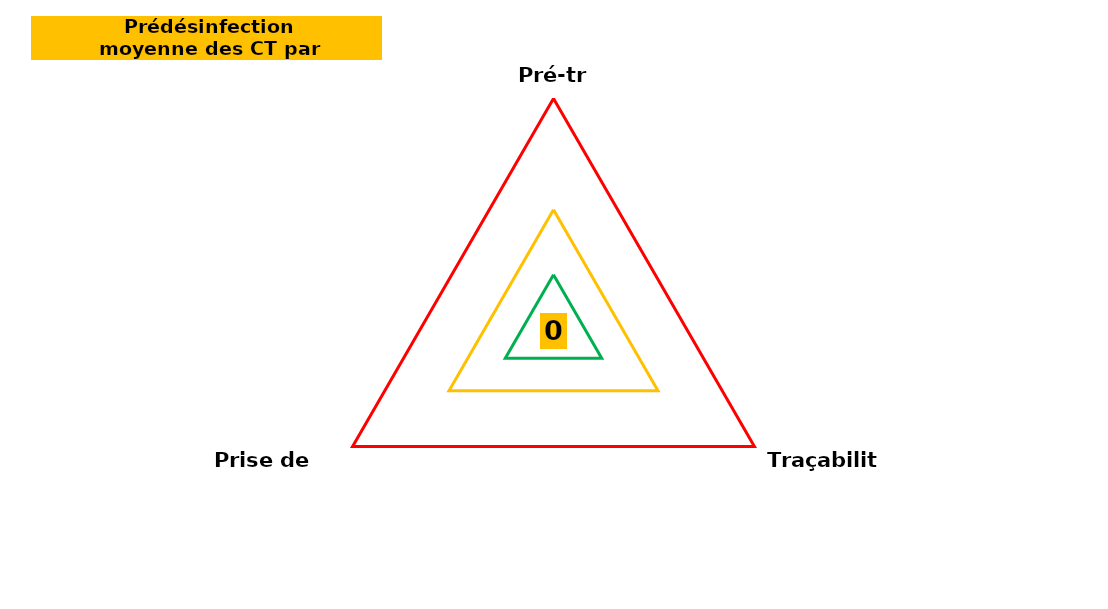
| Category | Series 1 | Series 0 | Series 2 | Series 3 |
|---|---|---|---|---|
| Pré-tri | 0 | 6 | 13 | 25 |
| Traçabilité | 0 | 6 | 13 | 25 |
| Prise de poste | 0 | 6 | 13 | 25 |